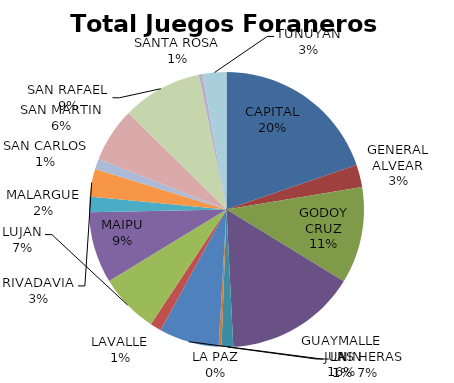
| Category | Total Juegos Foraneros Beneficio |
|---|---|
| CAPITAL | 783240.8 |
| GENERAL ALVEAR | 104307.15 |
| GODOY CRUZ | 450816.19 |
| GUAYMALLEN | 613273.37 |
| JUNIN | 54095.85 |
| LA PAZ | 13378.57 |
| LAS HERAS | 279304.71 |
| LAVALLE | 52330.38 |
| LUJAN | 277882.63 |
| MAIPU | 332780.09 |
| MALARGUE | 72919.07 |
| RIVADAVIA | 128986.84 |
| SAN CARLOS | 48759.16 |
| SAN MARTIN | 253269.44 |
| SAN RAFAEL  | 371820.06 |
| SANTA ROSA | 18210.41 |
| TUNUYAN | 110309.21 |